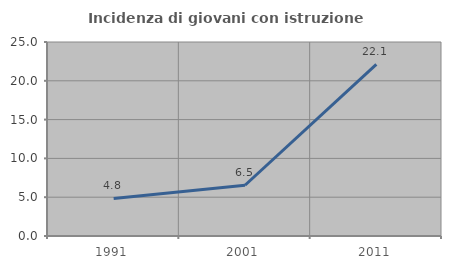
| Category | Incidenza di giovani con istruzione universitaria |
|---|---|
| 1991.0 | 4.839 |
| 2001.0 | 6.542 |
| 2011.0 | 22.115 |